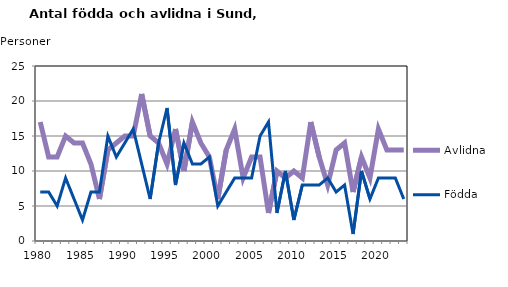
| Category | Avlidna | Födda |
|---|---|---|
| 1980.0 | 17 | 7 |
| 1981.0 | 12 | 7 |
| 1982.0 | 12 | 5 |
| 1983.0 | 15 | 9 |
| 1984.0 | 14 | 6 |
| 1985.0 | 14 | 3 |
| 1986.0 | 11 | 7 |
| 1987.0 | 6 | 7 |
| 1988.0 | 13 | 15 |
| 1989.0 | 14 | 12 |
| 1990.0 | 15 | 14 |
| 1991.0 | 15 | 16 |
| 1992.0 | 21 | 11 |
| 1993.0 | 15 | 6 |
| 1994.0 | 14 | 14 |
| 1995.0 | 11 | 19 |
| 1996.0 | 16 | 8 |
| 1997.0 | 10 | 14 |
| 1998.0 | 17 | 11 |
| 1999.0 | 14 | 11 |
| 2000.0 | 12 | 12 |
| 2001.0 | 6 | 5 |
| 2002.0 | 13 | 7 |
| 2003.0 | 16 | 9 |
| 2004.0 | 9 | 9 |
| 2005.0 | 12 | 9 |
| 2006.0 | 12 | 15 |
| 2007.0 | 4 | 17 |
| 2008.0 | 10 | 4 |
| 2009.0 | 9 | 10 |
| 2010.0 | 10 | 3 |
| 2011.0 | 9 | 8 |
| 2012.0 | 17 | 8 |
| 2013.0 | 12 | 8 |
| 2014.0 | 8 | 9 |
| 2015.0 | 13 | 7 |
| 2016.0 | 14 | 8 |
| 2017.0 | 7 | 1 |
| 2018.0 | 12 | 10 |
| 2019.0 | 9 | 6 |
| 2020.0 | 16 | 9 |
| 2021.0 | 13 | 9 |
| 2022.0 | 13 | 9 |
| 2023.0 | 13 | 6 |